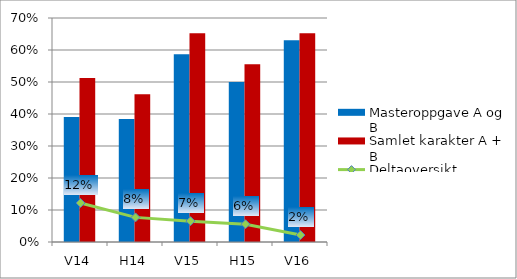
| Category | Masteroppgave A og B | Samlet karakter A + B |
|---|---|---|
| V14 | 0.39 | 0.512 |
| H14 | 0.385 | 0.462 |
| V15 | 0.587 | 0.652 |
| H15 | 0.5 | 0.556 |
| V16 | 0.63 | 0.652 |